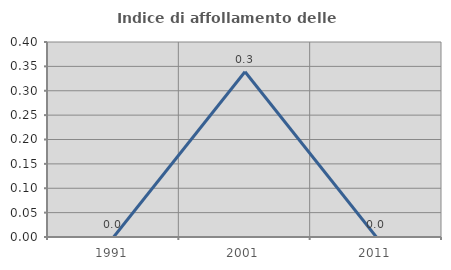
| Category | Indice di affollamento delle abitazioni  |
|---|---|
| 1991.0 | 0 |
| 2001.0 | 0.339 |
| 2011.0 | 0 |